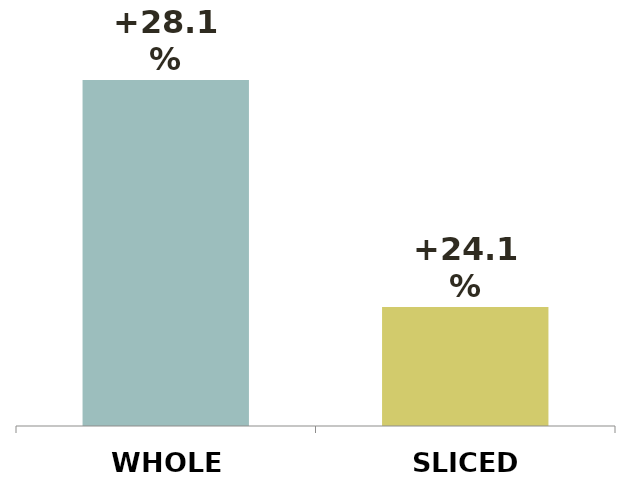
| Category | Series 0 |
|---|---|
| WHOLE | 0.281 |
| SLICED | 0.241 |